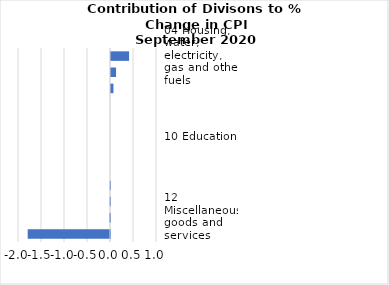
| Category |     Contributions |
|---|---|
| 04 Housing, water, electricity, gas and other fuels | 0.393 |
| 07 Transport | 0.11 |
| 11 Restaurants and hotels | 0.053 |
| 03 Clothing and footwear | 0 |
| 09 Recreation and culture | 0 |
| 10 Education | 0 |
| 08 Communication | 0 |
| 06 Health | 0 |
| 02 Alcoholic beverages, tobacco and narcotics | -0.005 |
| 05 Furnishings, household equipment and routine household maintenance | -0.008 |
| 12 Miscellaneous goods and services | -0.015 |
| 01 Food and non-alcoholic beverages | -1.79 |